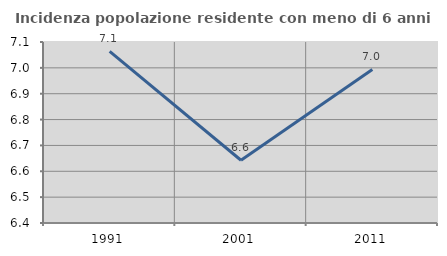
| Category | Incidenza popolazione residente con meno di 6 anni |
|---|---|
| 1991.0 | 7.064 |
| 2001.0 | 6.643 |
| 2011.0 | 6.994 |